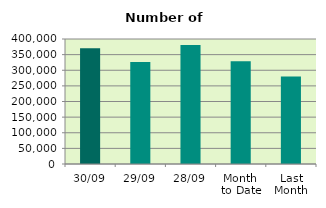
| Category | Series 0 |
|---|---|
| 30/09 | 370434 |
| 29/09 | 326562 |
| 28/09 | 380626 |
| Month 
to Date | 328669.364 |
| Last
Month | 279794.182 |